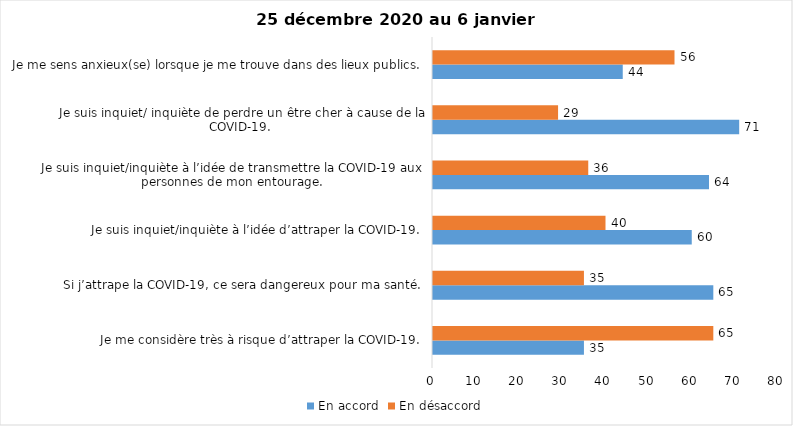
| Category | En accord | En désaccord |
|---|---|---|
| Je me considère très à risque d’attraper la COVID-19. | 35 | 65 |
| Si j’attrape la COVID-19, ce sera dangereux pour ma santé. | 65 | 35 |
| Je suis inquiet/inquiète à l’idée d’attraper la COVID-19. | 60 | 40 |
| Je suis inquiet/inquiète à l’idée de transmettre la COVID-19 aux personnes de mon entourage. | 64 | 36 |
| Je suis inquiet/ inquiète de perdre un être cher à cause de la COVID-19. | 71 | 29 |
| Je me sens anxieux(se) lorsque je me trouve dans des lieux publics. | 44 | 56 |